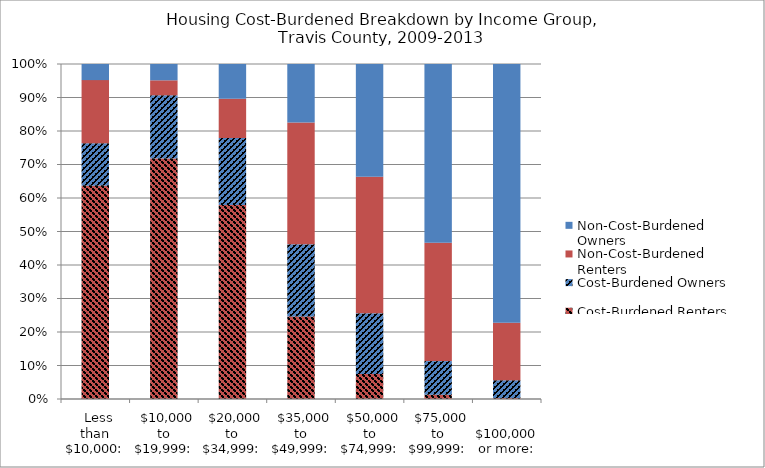
| Category | Cost-Burdened Renters | Cost-Burdened Owners | Non-Cost-Burdened Renters | Non-Cost-Burdened Owners |
|---|---|---|---|---|
|   Less than $10,000: | 0.636 | 0.127 | 0.189 | 0.048 |
|   $10,000 to $19,999: | 0.718 | 0.189 | 0.045 | 0.049 |
|   $20,000 to $34,999: | 0.579 | 0.2 | 0.117 | 0.104 |
|   $35,000 to $49,999: | 0.246 | 0.216 | 0.363 | 0.175 |
|   $50,000 to $74,999: | 0.075 | 0.181 | 0.407 | 0.337 |
|   $75,000 to $99,999: | 0.013 | 0.1 | 0.353 | 0.534 |
|   $100,000 or more: | 0.003 | 0.053 | 0.171 | 0.773 |